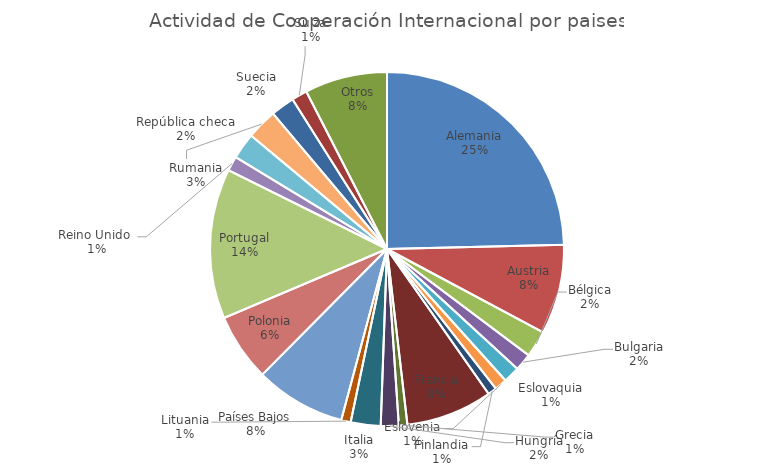
| Category | Nº DE EXPEDIENTES |
|---|---|
| Alemania | 2021 |
| Austria | 672 |
| Bélgica | 201 |
| Bulgaria | 130 |
| Eslovaquia | 123 |
| Eslovenia | 93 |
| Finlandia | 66 |
| Francia | 648 |
| Grecia | 64 |
| Hungría | 134 |
| Italia | 224 |
| Lituania | 71 |
| Países Bajos | 680 |
| Polonia | 508 |
| Portugal | 1126 |
| Reino Unido  | 110 |
| República checa | 196 |
| Rumania | 230 |
| Suecia | 178 |
| Suiza | 117 |
| Otros | 619 |